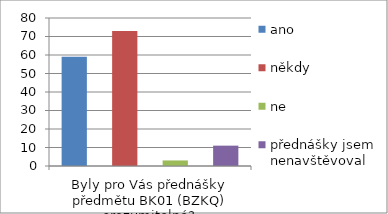
| Category | ano | někdy | ne | přednášky jsem nenavštěvoval |
|---|---|---|---|---|
| Byly pro Vás přednášky předmětu BK01 (BZKQ) srozumitelné? | 59 | 73 | 3 | 11 |